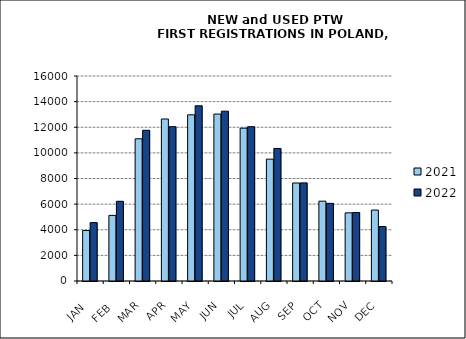
| Category | 2021 | 2022 |
|---|---|---|
|  JAN  | 3942 | 4557 |
|  FEB  | 5120 | 6222 |
| MAR | 11099 | 11764 |
| APR | 12644 | 12045 |
| MAY | 12970 | 13675 |
| JUN | 13029 | 13254 |
| JUL | 11926 | 12043 |
| AUG | 9511 | 10344 |
| SEP | 7650 | 7657 |
| OCT | 6231 | 6059 |
| NOV | 5319 | 5346 |
| DEC | 5536 | 4253 |